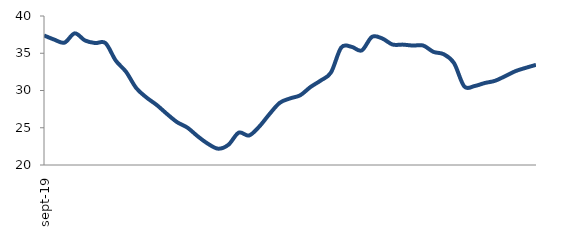
| Category | Series 0 |
|---|---|
| 2019-09-01 | 37.39 |
| 2019-10-01 | 36.831 |
| 2019-11-01 | 36.425 |
| 2019-12-01 | 37.671 |
| 2020-01-01 | 36.714 |
| 2020-02-01 | 36.369 |
| 2020-03-01 | 36.361 |
| 2020-04-01 | 34.017 |
| 2020-05-01 | 32.52 |
| 2020-06-01 | 30.328 |
| 2020-07-01 | 29.058 |
| 2020-08-01 | 28.052 |
| 2020-09-01 | 26.848 |
| 2020-10-01 | 25.737 |
| 2020-11-01 | 25.008 |
| 2020-12-01 | 23.848 |
| 2021-01-01 | 22.846 |
| 2021-02-01 | 22.188 |
| 2021-03-01 | 22.726 |
| 2021-04-01 | 24.345 |
| 2021-05-01 | 23.958 |
| 2021-06-01 | 25.156 |
| 2021-07-01 | 26.838 |
| 2021-08-01 | 28.346 |
| 2021-09-01 | 28.934 |
| 2021-10-01 | 29.363 |
| 2021-11-01 | 30.47 |
| 2021-12-01 | 31.341 |
| 2022-01-01 | 32.424 |
| 2022-02-01 | 35.771 |
| 2022-03-01 | 35.868 |
| 2022-04-01 | 35.381 |
| 2022-05-01 | 37.2 |
| 2022-06-01 | 36.986 |
| 2022-07-01 | 36.172 |
| 2022-08-01 | 36.157 |
| 2022-09-01 | 36.033 |
| 2022-10-01 | 36.034 |
| 2022-11-01 | 35.183 |
| 2022-12-01 | 34.87 |
| 2023-01-01 | 33.684 |
| 2023-02-01 | 30.55 |
| 2023-03-01 | 30.596 |
| 2023-04-01 | 31.004 |
| 2023-05-01 | 31.3 |
| 2023-06-01 | 31.93 |
| 2023-07-01 | 32.601 |
| 2023-08-01 | 33.043 |
| 2023-09-01 | 33.443 |